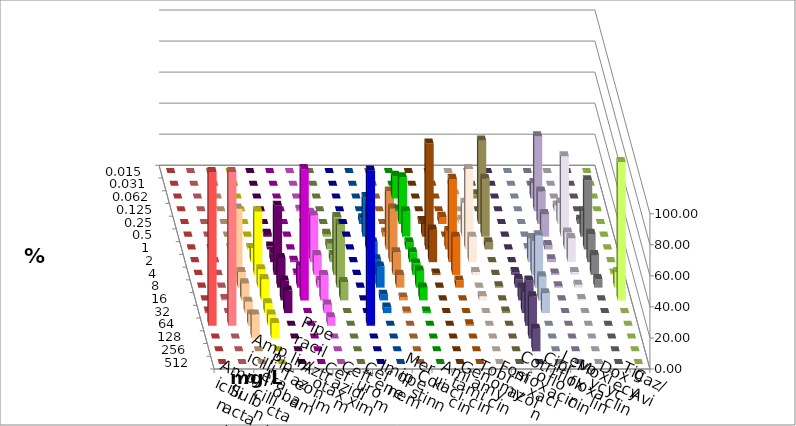
| Category | Ampicillin | Ampicillin/ Sulbactam | Piperacillin | Piperacillin/ Tazobactam | Aztreonam | Cefotaxim | Ceftazidim | Cefuroxim | Imipenem | Meropenem | Colistin | Amikacin | Gentamicin | Tobramycin | Fosfomycin | Cotrimoxazol | Ciprofloxacin | Levofloxacin | Moxifloxacin | Doxycyclin | Tigecyclin | Caz/Avi |
|---|---|---|---|---|---|---|---|---|---|---|---|---|---|---|---|---|---|---|---|---|---|---|
| 0.015 | 0 | 0 | 0 | 0 | 0 | 0 | 0 | 0 | 0 | 0 | 0 | 0 | 0 | 0 | 0 | 0 | 0 | 0 | 0 | 0 | 0 | 0 |
| 0.031 | 0 | 0 | 0 | 0 | 0 | 0 | 0 | 0 | 0 | 0 | 0 | 0 | 0 | 0 | 0 | 0 | 0 | 0 | 0 | 0 | 0 | 0 |
| 0.062 | 0 | 0 | 0 | 0 | 0 | 0 | 0 | 0 | 0 | 14.545 | 0 | 0 | 2.727 | 2.727 | 0 | 0 | 10 | 0 | 0 | 0 | 0 | 0 |
| 0.125 | 0 | 0 | 0 | 0 | 0 | 0 | 0.909 | 0 | 0 | 0.909 | 0 | 0 | 0 | 0 | 0 | 0 | 48.182 | 3.636 | 0 | 0 | 0 | 0 |
| 0.25 | 0 | 0 | 0 | 0 | 0 | 0 | 0 | 0 | 3.636 | 30 | 1.818 | 4.545 | 2.727 | 53.636 | 0 | 0 | 20.909 | 13.636 | 2.727 | 0 | 0 | 0 |
| 0.5 | 0 | 0 | 0 | 0 | 1.818 | 0 | 0.909 | 0 | 25.455 | 16.364 | 8.182 | 0 | 21.818 | 37.273 | 0 | 0 | 14.545 | 51.818 | 16.364 | 0 | 1.818 | 2.727 |
| 1.0 | 0 | 0 | 0.909 | 0.909 | 1.818 | 0 | 23.636 | 0 | 27.273 | 4.545 | 68.182 | 11.818 | 51.818 | 4.545 | 0 | 0.909 | 2.727 | 10.909 | 44.545 | 0 | 3.636 | 37.273 |
| 2.0 | 0 | 0 | 5.455 | 9.091 | 5.455 | 0.909 | 30 | 0 | 12.727 | 6.364 | 20.909 | 53.636 | 16.364 | 0 | 0 | 15.455 | 1.818 | 15.455 | 18.182 | 0 | 4.545 | 34.545 |
| 4.0 | 0 | 0 | 42.727 | 40.909 | 44.545 | 0.909 | 12.727 | 0 | 10 | 7.273 | 0.909 | 24.545 | 1.818 | 0 | 1.818 | 21.818 | 0.909 | 1.818 | 12.727 | 0.909 | 37.273 | 14.545 |
| 8.0 | 0 | 0 | 10 | 11.818 | 19.091 | 13.636 | 4.545 | 0 | 13.636 | 10.909 | 0 | 4.545 | 0 | 0.909 | 5.455 | 33.636 | 0.909 | 1.818 | 5.455 | 10 | 40.909 | 8.182 |
| 16.0 | 0 | 0.909 | 10.909 | 13.636 | 12.727 | 84.545 | 16.364 | 0 | 3.636 | 8.182 | 0 | 0 | 2.727 | 0 | 8.182 | 15.455 | 0 | 0.909 | 0 | 89.091 | 11.818 | 1.818 |
| 32.0 | 0.909 | 0 | 7.273 | 6.364 | 14.545 | 0 | 5.455 | 0 | 3.636 | 0.909 | 0 | 0 | 0 | 0.909 | 13.636 | 12.727 | 0 | 0 | 0 | 0 | 0 | 0.909 |
| 64.0 | 99.091 | 99.091 | 7.273 | 7.273 | 0 | 0 | 5.455 | 100 | 0 | 0 | 0 | 0.909 | 0 | 0 | 29.091 | 0 | 0 | 0 | 0 | 0 | 0 | 0 |
| 128.0 | 0 | 0 | 15.455 | 10 | 0 | 0 | 0 | 0 | 0 | 0 | 0 | 0 | 0 | 0 | 27.273 | 0 | 0 | 0 | 0 | 0 | 0 | 0 |
| 256.0 | 0 | 0 | 0 | 0 | 0 | 0 | 0 | 0 | 0 | 0 | 0 | 0 | 0 | 0 | 14.545 | 0 | 0 | 0 | 0 | 0 | 0 | 0 |
| 512.0 | 0 | 0 | 0 | 0 | 0 | 0 | 0 | 0 | 0 | 0 | 0 | 0 | 0 | 0 | 0 | 0 | 0 | 0 | 0 | 0 | 0 | 0 |